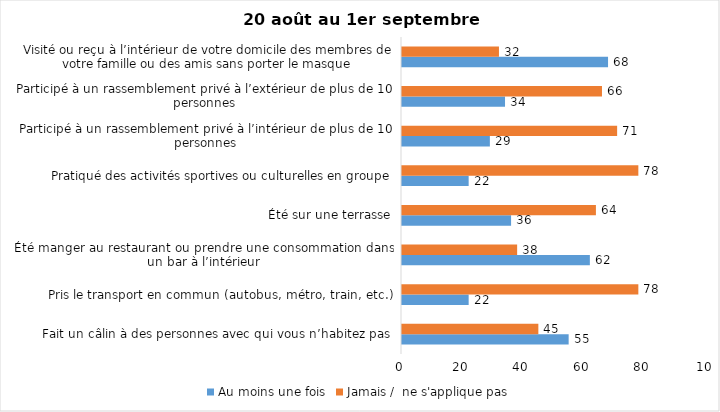
| Category | Au moins une fois | Jamais /  ne s'applique pas |
|---|---|---|
| Fait un câlin à des personnes avec qui vous n’habitez pas | 55 | 45 |
| Pris le transport en commun (autobus, métro, train, etc.) | 22 | 78 |
| Été manger au restaurant ou prendre une consommation dans un bar à l’intérieur | 62 | 38 |
| Été sur une terrasse | 36 | 64 |
| Pratiqué des activités sportives ou culturelles en groupe | 22 | 78 |
| Participé à un rassemblement privé à l’intérieur de plus de 10 personnes | 29 | 71 |
| Participé à un rassemblement privé à l’extérieur de plus de 10 personnes | 34 | 66 |
| Visité ou reçu à l’intérieur de votre domicile des membres de votre famille ou des amis sans porter le masque | 68 | 32 |